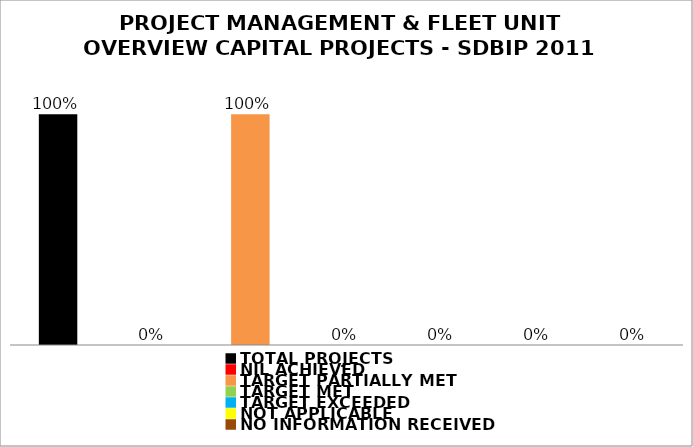
| Category | Series 1 |
|---|---|
| TOTAL PROJECTS | 1 |
| NIL ACHIEVED | 0 |
| TARGET PARTIALLY MET | 1 |
| TARGET MET | 0 |
| TARGET EXCEEDED | 0 |
| NOT APPLICABLE | 0 |
| NO INFORMATION RECEIVED | 0 |